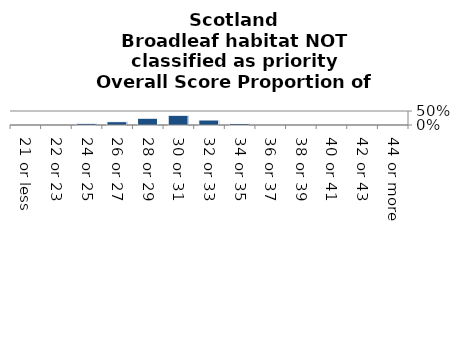
| Category | Broadleaf habitat NOT classified as priority |
|---|---|
| 21 or less | 0 |
| 22 or 23 | 0 |
| 24 or 25 | 0.059 |
| 26 or 27 | 0.119 |
| 28 or 29 | 0.241 |
| 30 or 31 | 0.346 |
| 32 or 33 | 0.178 |
| 34 or 35 | 0.056 |
| 36 or 37 | 0 |
| 38 or 39 | 0 |
| 40 or 41 | 0 |
| 42 or 43 | 0 |
| 44 or more | 0 |